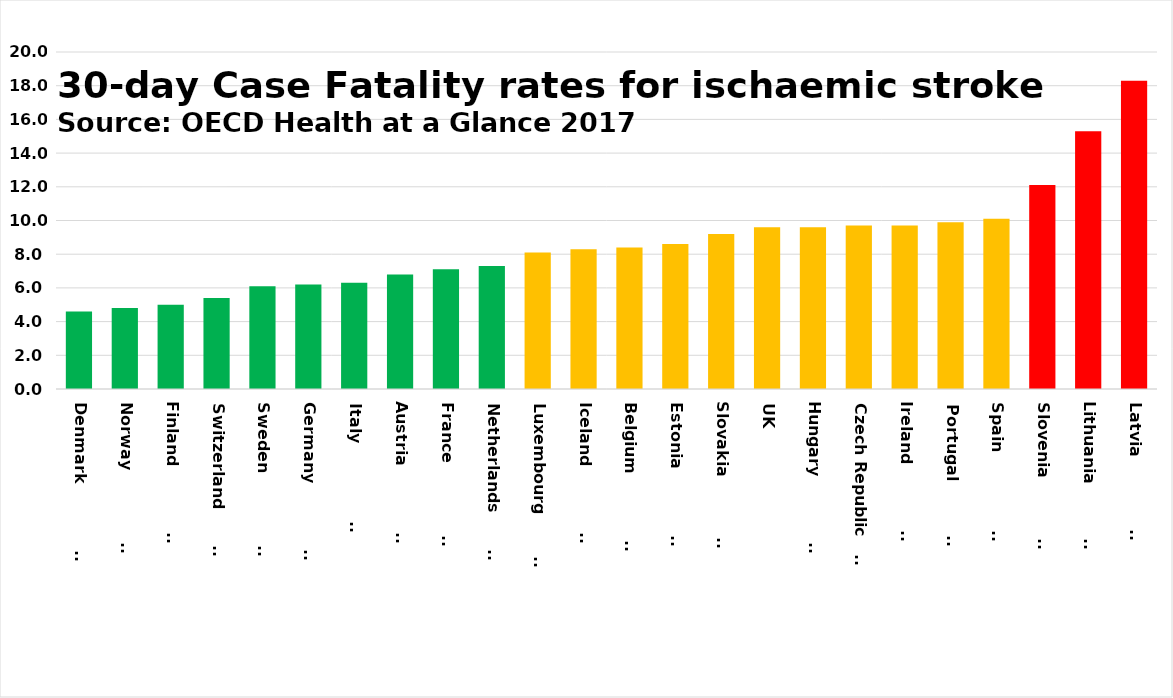
| Category | Series 0 |
|---|---|
| Denmark                | 4.6 |
| Norway                 | 4.8 |
| Finland                | 5 |
| Switzerland            | 5.4 |
| Sweden                 | 6.1 |
| Germany                | 6.2 |
| Italy                  | 6.3 |
| Austria                | 6.8 |
| France                 | 7.1 |
| Netherlands            | 7.3 |
| Luxembourg             | 8.1 |
| Iceland                | 8.3 |
| Belgium                | 8.4 |
| Estonia                | 8.6 |
| Slovakia               | 9.2 |
| UK | 9.6 |
| Hungary                | 9.6 |
| Czech Republic         | 9.7 |
| Ireland                | 9.7 |
| Portugal               | 9.9 |
| Spain                  | 10.1 |
| Slovenia               | 12.1 |
| Lithuania              | 15.3 |
| Latvia                 | 18.3 |